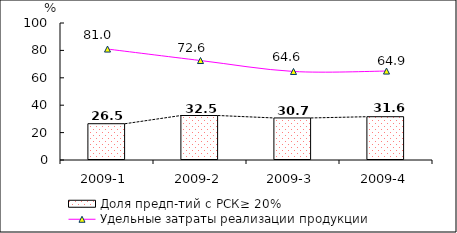
| Category | Доля предп-тий с РСК≥ 20% |
|---|---|
| 2009-1 | 26.488 |
| 2009-2 | 32.473 |
| 2009-3 | 30.697 |
| 2009-4 | 31.598 |